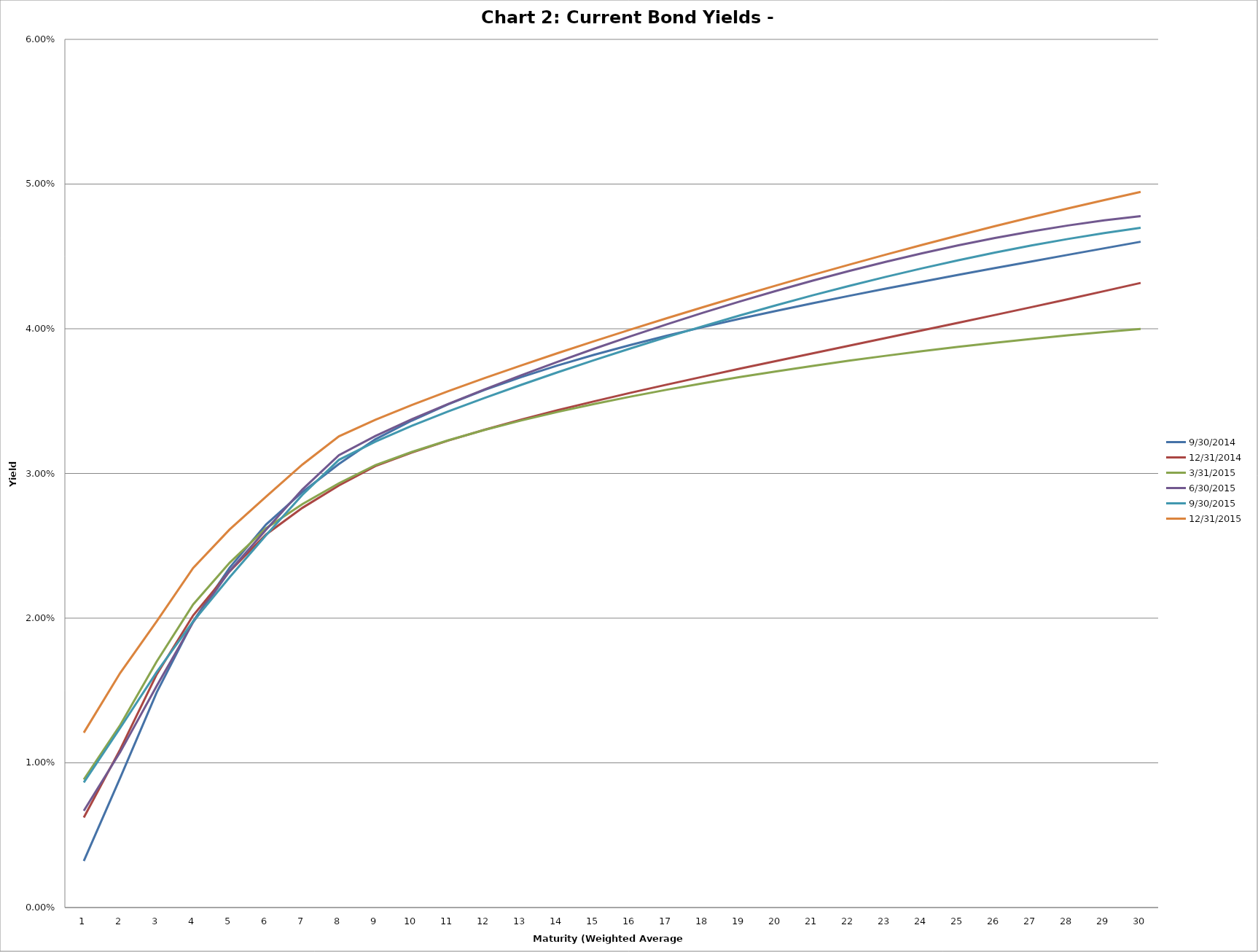
| Category | 9/30/2014 | 12/31/2014 | 3/31/2015 | 6/30/2015 | 9/30/2015 | 12/31/2015 |
|---|---|---|---|---|---|---|
| 0 | 0.003 | 0.006 | 0.009 | 0.007 | 0.009 | 0.012 |
| 1 | 0.009 | 0.011 | 0.013 | 0.011 | 0.012 | 0.016 |
| 2 | 0.015 | 0.016 | 0.017 | 0.015 | 0.016 | 0.02 |
| 3 | 0.02 | 0.02 | 0.021 | 0.02 | 0.02 | 0.023 |
| 4 | 0.023 | 0.023 | 0.024 | 0.023 | 0.023 | 0.026 |
| 5 | 0.026 | 0.026 | 0.026 | 0.026 | 0.026 | 0.028 |
| 6 | 0.029 | 0.028 | 0.028 | 0.029 | 0.029 | 0.031 |
| 7 | 0.031 | 0.029 | 0.029 | 0.031 | 0.031 | 0.033 |
| 8 | 0.032 | 0.031 | 0.031 | 0.033 | 0.032 | 0.034 |
| 9 | 0.034 | 0.031 | 0.031 | 0.034 | 0.033 | 0.035 |
| 10 | 0.035 | 0.032 | 0.032 | 0.035 | 0.034 | 0.036 |
| 11 | 0.036 | 0.033 | 0.033 | 0.036 | 0.035 | 0.037 |
| 12 | 0.037 | 0.034 | 0.034 | 0.037 | 0.036 | 0.037 |
| 13 | 0.037 | 0.034 | 0.034 | 0.038 | 0.037 | 0.038 |
| 14 | 0.038 | 0.035 | 0.035 | 0.039 | 0.038 | 0.039 |
| 15 | 0.039 | 0.036 | 0.035 | 0.039 | 0.039 | 0.04 |
| 16 | 0.04 | 0.036 | 0.036 | 0.04 | 0.039 | 0.041 |
| 17 | 0.04 | 0.037 | 0.036 | 0.041 | 0.04 | 0.042 |
| 18 | 0.041 | 0.037 | 0.037 | 0.042 | 0.041 | 0.042 |
| 19 | 0.041 | 0.038 | 0.037 | 0.043 | 0.042 | 0.043 |
| 20 | 0.042 | 0.038 | 0.037 | 0.043 | 0.042 | 0.044 |
| 21 | 0.042 | 0.039 | 0.038 | 0.044 | 0.043 | 0.044 |
| 22 | 0.043 | 0.039 | 0.038 | 0.045 | 0.044 | 0.045 |
| 23 | 0.043 | 0.04 | 0.038 | 0.045 | 0.044 | 0.046 |
| 24 | 0.044 | 0.04 | 0.039 | 0.046 | 0.045 | 0.046 |
| 25 | 0.044 | 0.041 | 0.039 | 0.046 | 0.045 | 0.047 |
| 26 | 0.045 | 0.041 | 0.039 | 0.047 | 0.046 | 0.048 |
| 27 | 0.045 | 0.042 | 0.04 | 0.047 | 0.046 | 0.048 |
| 28 | 0.046 | 0.043 | 0.04 | 0.047 | 0.047 | 0.049 |
| 29 | 0.046 | 0.043 | 0.04 | 0.048 | 0.047 | 0.049 |